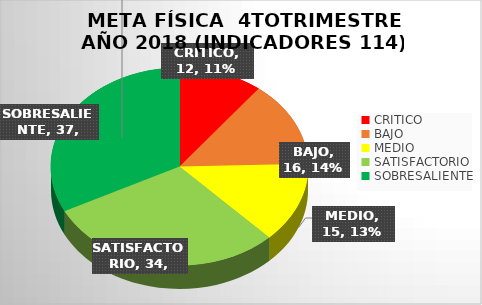
| Category | Series 0 |
|---|---|
| CRITICO | 12 |
| BAJO | 16 |
| MEDIO | 15 |
| SATISFACTORIO | 34 |
| SOBRESALIENTE | 37 |